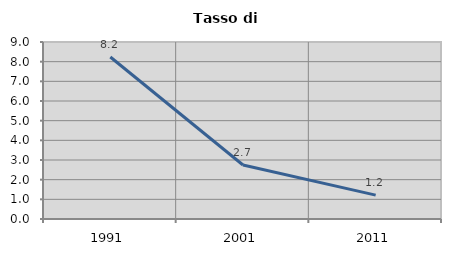
| Category | Tasso di disoccupazione   |
|---|---|
| 1991.0 | 8.238 |
| 2001.0 | 2.745 |
| 2011.0 | 1.212 |